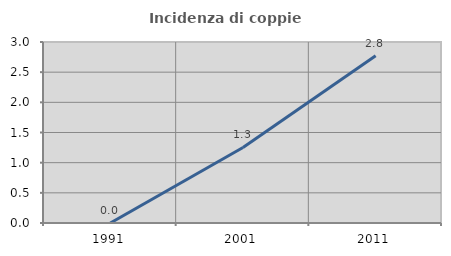
| Category | Incidenza di coppie miste |
|---|---|
| 1991.0 | 0 |
| 2001.0 | 1.252 |
| 2011.0 | 2.773 |